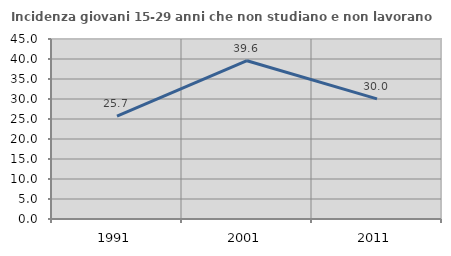
| Category | Incidenza giovani 15-29 anni che non studiano e non lavorano  |
|---|---|
| 1991.0 | 25.72 |
| 2001.0 | 39.574 |
| 2011.0 | 30.023 |